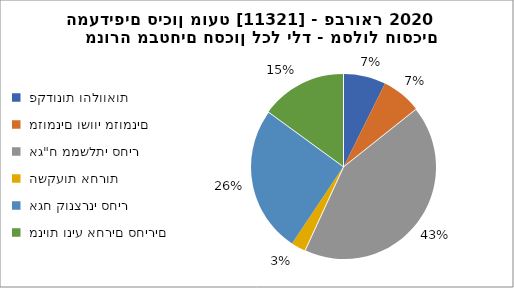
| Category | מנורה מבטחים חסכון לכל ילד - מסלול חוסכים המעדיפים סיכון מועט [11321] - פברואר 2020 |
|---|---|
|  פקדונות והלוואות  | 17280 |
|  מזומנים ושווי מזומנים   | 16337 |
|  אג"ח ממשלתי סחיר  | 100141 |
|  השקעות אחרות  | 5891 |
|  אגח קונצרני סחיר  | 60374 |
|  מניות וניע אחרים סחירים   | 35265 |